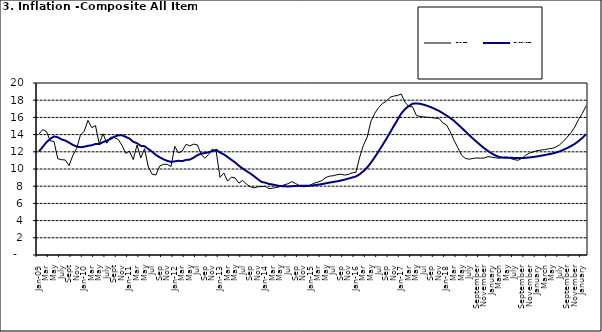
| Category | Year-on Rate | 12-Month Average |
|---|---|---|
| Jan-09 | 14.034 | 12.032 |
| Feb | 14.584 | 12.567 |
| Mar | 14.366 | 13.101 |
| Apr | 13.268 | 13.51 |
| May | 13.212 | 13.787 |
| June | 11.194 | 13.694 |
| July | 11.09 | 13.437 |
| Aug | 11.046 | 13.307 |
| Sept | 10.39 | 13.065 |
| Oct | 11.588 | 12.803 |
| Nov | 12.368 | 12.609 |
| Dec | 13.93 | 12.538 |
| Jan-10 | 14.398 | 12.586 |
| Feb | 15.649 | 12.7 |
| Mar | 14.812 | 12.757 |
| Apr | 15.044 | 12.915 |
| May | 12.915 | 12.893 |
| June | 14.099 | 13.132 |
| July | 13.002 | 13.284 |
| Aug | 13.702 | 13.5 |
| Sept | 13.65 | 13.764 |
| Oct | 13.45 | 13.908 |
| Nov | 12.766 | 13.928 |
| Dec | 11.815 | 13.74 |
| Jan-11 | 12.08 | 13.542 |
| Feb | 11.1 | 13.161 |
| Mar | 12.779 | 13.001 |
| Apr | 11.291 | 12.694 |
| May | 12.352 | 12.648 |
| Jun | 10.23 | 12.321 |
| Jul | 9.397 | 12.009 |
| Aug | 9.301 | 11.635 |
| Sep | 10.339 | 11.363 |
| Oct | 10.544 | 11.13 |
| Nov | 10.54 | 10.952 |
| Dec | 10.283 | 10.826 |
| Jan-12 | 12.626 | 10.886 |
| Feb | 11.866 | 10.955 |
| Mar | 12.111 | 10.914 |
| Apr | 12.866 | 11.054 |
| May | 12.688 | 11.096 |
| Jun | 12.892 | 11.32 |
| Jul | 12.797 | 11.599 |
| Aug | 11.689 | 11.791 |
| Sep | 11.253 | 11.859 |
| Oct | 11.693 | 11.948 |
| Nov | 12.32 | 12.091 |
| Dec | 11.981 | 12.224 |
| Jan-13 | 9.031 | 11.908 |
| Feb | 9.542 | 11.703 |
| Mar | 8.593 | 11.394 |
| Apr | 9.052 | 11.072 |
| May | 8.964 | 10.761 |
| Jun | 8.353 | 10.383 |
| Jul | 8.682 | 10.047 |
| Aug | 8.231 | 9.761 |
| Sep | 7.952 | 9.486 |
| Oct | 7.807 | 9.167 |
| Nov | 7.931 | 8.815 |
| Dec | 7.957 | 8.496 |
| Jan-14 | 7.977 | 8.408 |
| Feb | 7.707 | 8.257 |
| Mar | 7.783 | 8.19 |
| Apr | 7.851 | 8.092 |
| May | 7.965 | 8.012 |
| Jun | 8.167 | 7.998 |
| Jul | 8.281 | 7.968 |
| Aug | 8.534 | 7.996 |
| Sep | 8.317 | 8.027 |
| Oct | 8.06 | 8.047 |
| Nov | 7.927 | 8.046 |
| Dec | 7.978 | 8.047 |
| Jan-15 | 8.157 | 8.063 |
| Feb | 8.359 | 8.117 |
| Mar | 8.494 | 8.176 |
| Apr | 8.655 | 8.243 |
| May | 9.003 | 8.331 |
| Jun | 9.168 | 8.417 |
| Jul | 9.218 | 8.497 |
| Aug | 9.336 | 8.566 |
| Sep | 9.394 | 8.658 |
| Oct | 9.296 | 8.76 |
| Nov | 9.368 | 8.879 |
| Dec | 9.554 | 9.009 |
| Jan-16 | 9.617 | 9.13 |
| Feb | 11.379 | 9.386 |
| Mar | 12.775 | 9.751 |
| Apr | 13.721 | 10.182 |
| May | 15.577 | 10.746 |
| Jun | 16.48 | 11.372 |
| Jul | 17.127 | 12.045 |
| Aug | 17.609 | 12.744 |
| Sep | 17.852 | 13.454 |
| Oct | 18.33 | 14.206 |
| Nov | 18.476 | 14.958 |
| Dec | 18.547 | 15.697 |
| Jan-17 | 18.719 | 16.441 |
| Feb | 17.78 | 16.958 |
| Mar | 17.256 | 17.315 |
| Apr | 17.244 | 17.591 |
| May | 16.251 | 17.628 |
| Jun | 16.098 | 17.578 |
| Jul | 16.053 | 17.475 |
| Aug | 16.012 | 17.331 |
| Sep | 15.979 | 17.17 |
| Oct | 15.905 | 16.968 |
| Nov | 15.901 | 16.76 |
| Dec | 15.372 | 16.502 |
| Jan-18 | 15.127 | 16.215 |
| Feb | 14.33 | 15.93 |
| Mar | 13.337 | 15.599 |
| Apr | 12.482 | 15.196 |
| May | 11.608 | 14.793 |
| June | 11.231 | 14.371 |
| July | 11.142 | 13.95 |
| August | 11.227 | 13.546 |
| September | 11.284 | 13.157 |
| October | 11.259 | 12.777 |
| November | 11.281 | 12.406 |
| December | 11.442 | 12.095 |
| January | 11.374 | 11.801 |
| February | 11.306 | 11.564 |
| March | 11.251 | 11.401 |
| April | 11.372 | 11.314 |
| May | 11.396 | 11.299 |
| June | 11.217 | 11.297 |
| July | 11.084 | 11.291 |
| August | 11.016 | 11.271 |
| September | 11.244 | 11.268 |
| October | 11.607 | 11.298 |
| November | 11.854 | 11.348 |
| December | 11.982 | 11.396 |
| January | 12.132 | 11.462 |
| February | 12.199 | 11.539 |
| March | 12.257 | 11.624 |
| April | 12.341 | 11.706 |
| May | 12.404 | 11.791 |
| June | 12.559 | 11.904 |
| July | 12.821 | 12.049 |
| August | 13.22 | 12.233 |
| September | 13.707 | 12.44 |
| October | 14.233 | 12.664 |
| November | 14.887 | 12.923 |
| December | 15.753 | 13.246 |
| January | 16.466 | 13.616 |
| February | 17.335 | 14.053 |